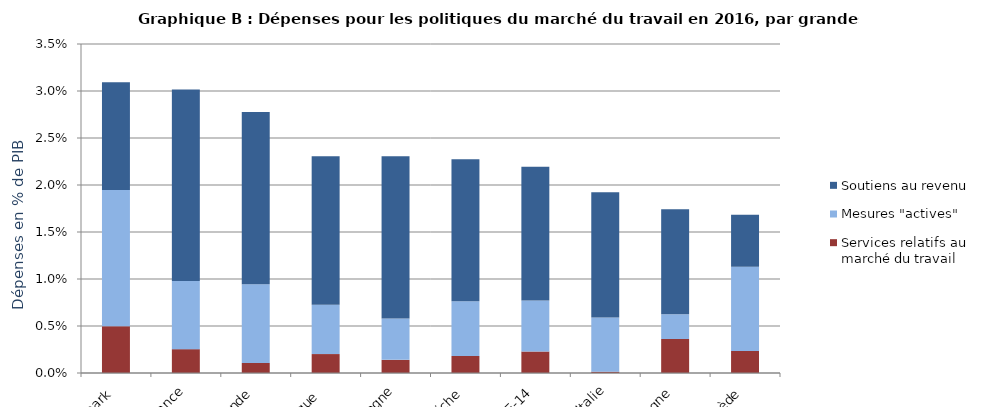
| Category | Services relatifs au marché du travail | Mesures "actives" | Soutiens au revenu |
|---|---|---|---|
| Danemark | 0.005 | 0.015 | 0.011 |
| France | 0.003 | 0.007 | 0.02 |
| Finlande | 0.001 | 0.008 | 0.018 |
| Belgique  | 0.002 | 0.005 | 0.016 |
| Espagne | 0.001 | 0.004 | 0.017 |
| Autriche | 0.002 | 0.006 | 0.015 |
| UE-14 | 0.002 | 0.005 | 0.014 |
| Italie | 0 | 0.006 | 0.013 |
| Allemagne | 0.004 | 0.003 | 0.011 |
| Suède | 0.002 | 0.009 | 0.006 |